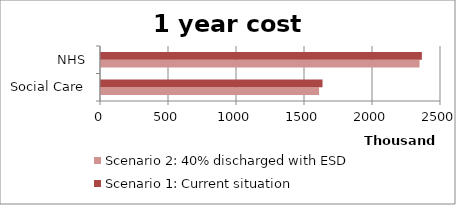
| Category | Scenario 2: 40% discharged with ESD | Scenario 1: Current situation |
|---|---|---|
| 0 | 1603382.24 | 1628776.504 |
| 1 | 2342132.2 | 2359264.81 |